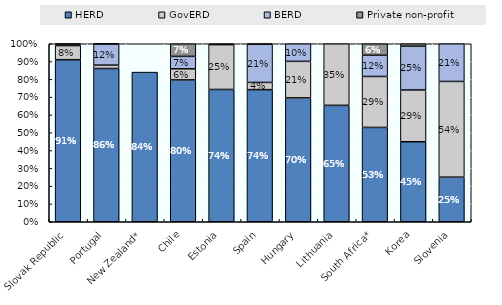
| Category | HERD | GovERD | BERD | Private non-profit |
|---|---|---|---|---|
| Slovak Republic | 0.911 | 0.079 | 0.008 | 0.002 |
| Portugal | 0.861 | 0.019 | 0.119 | 0.001 |
| New Zealand* | 0.841 | 0 | 0 | 0 |
| Chile | 0.797 | 0.062 | 0.07 | 0.071 |
| Estonia | 0.743 | 0.252 | 0 | 0.005 |
| Spain | 0.742 | 0.04 | 0.214 | 0.003 |
| Hungary | 0.696 | 0.205 | 0.099 | 0 |
| Lithuania | 0.654 | 0.346 | 0 | 0 |
| South Africa* | 0.53 | 0.286 | 0.119 | 0.065 |
| Korea | 0.449 | 0.291 | 0.246 | 0.014 |
| Slovenia | 0.25 | 0.538 | 0.212 | 0 |